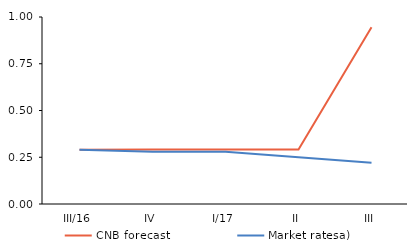
| Category | CNB forecast | Market ratesa) |
|---|---|---|
| III/16 | 0.29 | 0.29 |
| IV | 0.291 | 0.28 |
| I/17 | 0.291 | 0.28 |
| II | 0.291 | 0.25 |
| III | 0.945 | 0.22 |